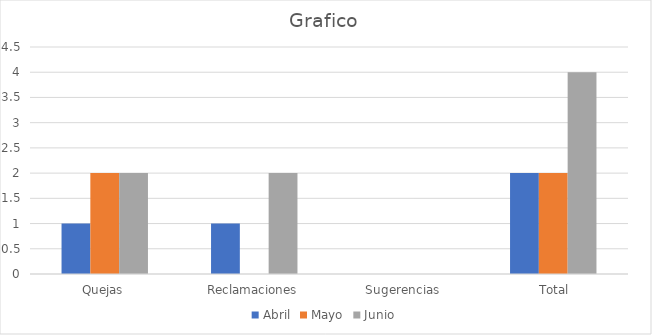
| Category | Abril | Mayo | Junio |
|---|---|---|---|
| Quejas | 1 | 2 | 2 |
| Reclamaciones | 1 | 0 | 2 |
| Sugerencias | 0 | 0 | 0 |
|  Total | 2 | 2 | 4 |